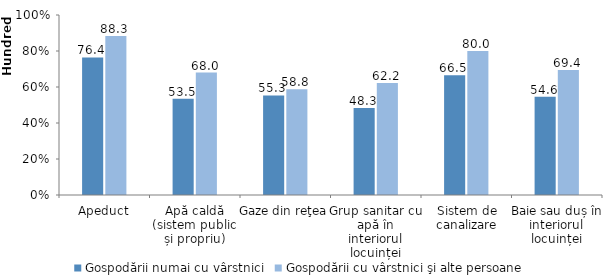
| Category | Gospodării numai cu vârstnici | Gospodării cu vârstnici şi alte persoane |
|---|---|---|
| Apeduct | 76.4 | 88.3 |
| Apă caldă (sistem public și propriu) | 53.5 | 68 |
| Gaze din reţea | 55.3 | 58.8 |
| Grup sanitar cu apă în interiorul locuinței | 48.3 | 62.2 |
| Sistem de canalizare | 66.5 | 80 |
| Baie sau duș în interiorul locuinței | 54.6 | 69.4 |